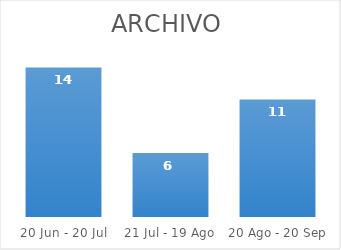
| Category | Series 0 |
|---|---|
| 20 Jun - 20 Jul | 14 |
| 21 Jul - 19 Ago | 6 |
| 20 Ago - 20 Sep | 11 |